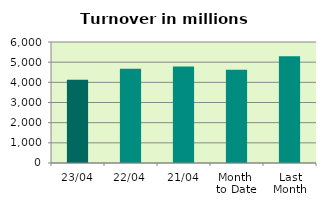
| Category | Series 0 |
|---|---|
| 23/04 | 4129.297 |
| 22/04 | 4667.714 |
| 21/04 | 4784.064 |
| Month 
to Date | 4624.955 |
| Last
Month | 5289.077 |